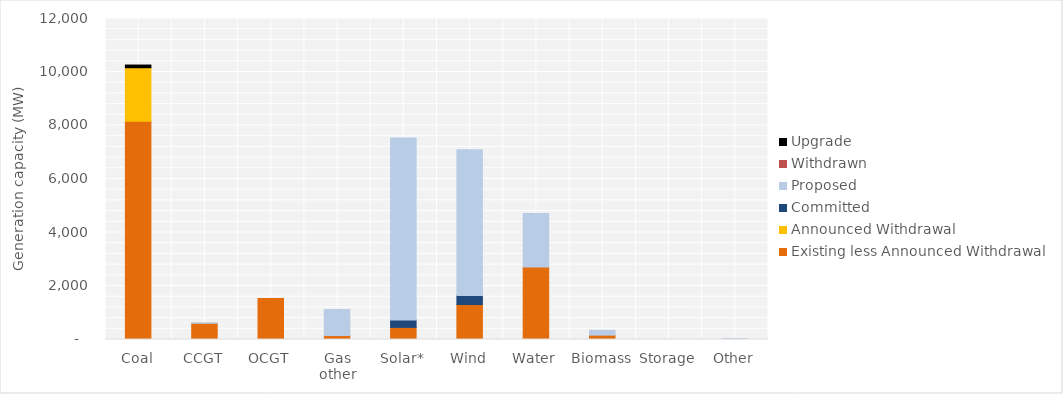
| Category | Existing less Announced Withdrawal | Announced Withdrawal | Committed | Proposed | Withdrawn | Upgrade |
|---|---|---|---|---|---|---|
| Coal | 8160 | 2000 | 0 | 0 | 0 | 100 |
| CCGT | 605.9 | 0 | 0 | 15 | 0 | 0 |
| OCGT | 1530 | 0 | 0 | 0 | 0 | 0 |
| Gas other | 147.268 | 0 | 0 | 975 | 0 | 0 |
| Solar* | 452.023 | 0 | 278.4 | 6799.9 | 0 | 0 |
| Wind | 1307 | 0 | 339.19 | 5444.52 | 0 | 0 |
| Water | 2706.1 | 0 | 0 | 2000 | 0 | 0 |
| Biomass | 162.874 | 0 | 0 | 180.6 | 0 | 0 |
| Storage | 0 | 0 | 0 | 0 | 0 | 0 |
| Other | 9.13 | 0 | 0 | 28.8 | 0 | 0 |